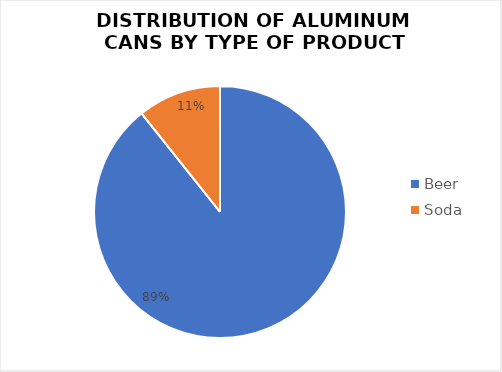
| Category | Series 0 |
|---|---|
| Beer | 1318 |
| Soda | 158 |